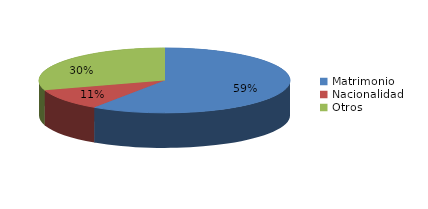
| Category | Series 0 |
|---|---|
| Matrimonio | 1344 |
| Nacionalidad | 242 |
| Otros | 676 |